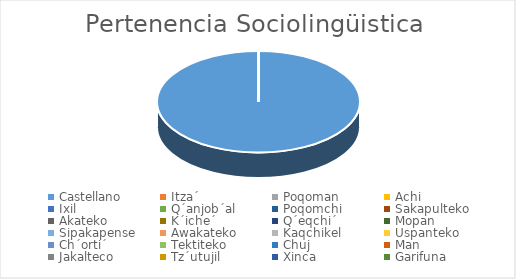
| Category | Series 0 |
|---|---|
| Castellano | 75 |
| Itza´ | 0 |
| Poqoman | 0 |
| Achi | 0 |
| Ixil | 0 |
| Q´anjob´al | 0 |
| Poqomchi | 0 |
| Sakapulteko | 0 |
| Akateko | 0 |
| K´iche´ | 0 |
| Q´eqchi´ | 0 |
| Mopan | 0 |
| Sipakapense | 0 |
| Awakateko | 0 |
| Kaqchikel | 0 |
| Uspanteko | 0 |
| Ch´orti´ | 0 |
| Tektiteko | 0 |
| Chuj | 0 |
| Man | 0 |
| Jakalteco | 0 |
| Tz´utujil | 0 |
| Xinca | 0 |
| Garifuna | 0 |